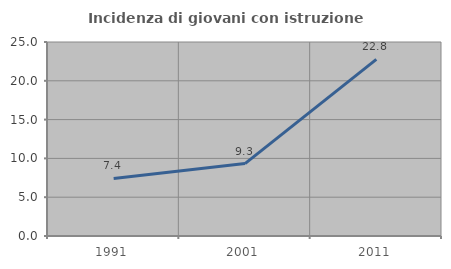
| Category | Incidenza di giovani con istruzione universitaria |
|---|---|
| 1991.0 | 7.418 |
| 2001.0 | 9.333 |
| 2011.0 | 22.757 |